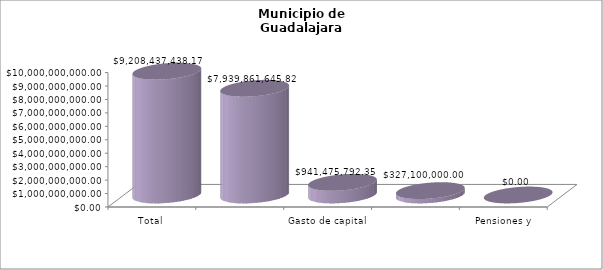
| Category | Municipio de Guadalajara
Tipo de Gasto de los ejercicios fiscales 2017-2022 |
|---|---|
| Total | 9208437438.17 |
| Gasto corriente | 7939861645.82 |
| Gasto de capital | 941475792.35 |
| Amortización de la deuda y disminución de pasivos | 327100000 |
| Pensiones y Jubilaciones | 0 |